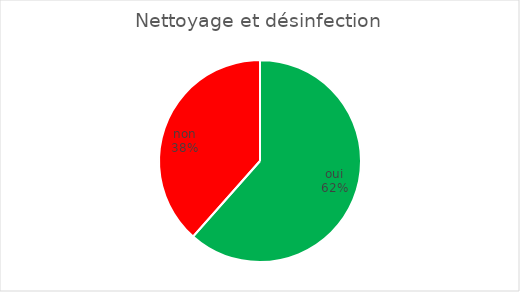
| Category | Nettoyage et désinfection |
|---|---|
| oui | 8 |
| non | 5 |